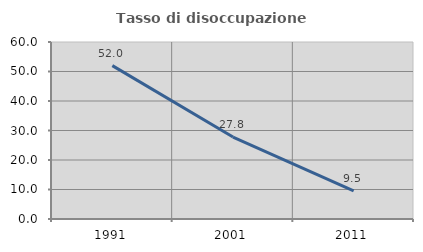
| Category | Tasso di disoccupazione giovanile  |
|---|---|
| 1991.0 | 52 |
| 2001.0 | 27.778 |
| 2011.0 | 9.524 |